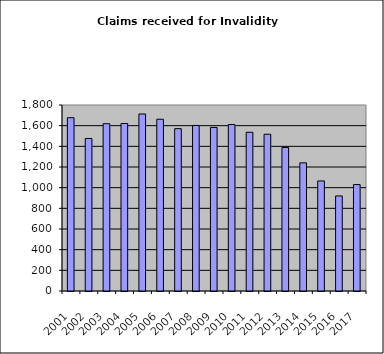
| Category | Series 1 |
|---|---|
| 2001.0 | 1677 |
| 2002.0 | 1476 |
| 2003.0 | 1619 |
| 2004.0 | 1621 |
| 2005.0 | 1713 |
| 2006.0 | 1662 |
| 2007.0 | 1571 |
| 2008.0 | 1602 |
| 2009.0 | 1583 |
| 2010.0 | 1611 |
| 2011.0 | 1536 |
| 2012.0 | 1517 |
| 2013.0 | 1389 |
| 2014.0 | 1240 |
| 2015.0 | 1065 |
| 2016.0 | 920 |
| 2017.0 | 1030 |